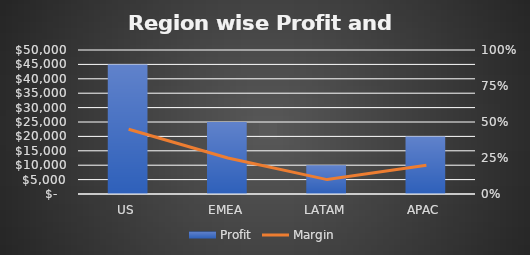
| Category | Profit |
|---|---|
| US | 45000 |
| EMEA | 25000 |
| LATAM | 10000 |
| APAC | 20000 |